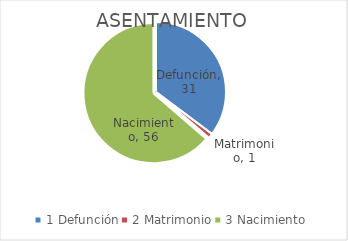
| Category | Series 0 |
|---|---|
| 0 | 31 |
| 1 | 1 |
| 2 | 56 |